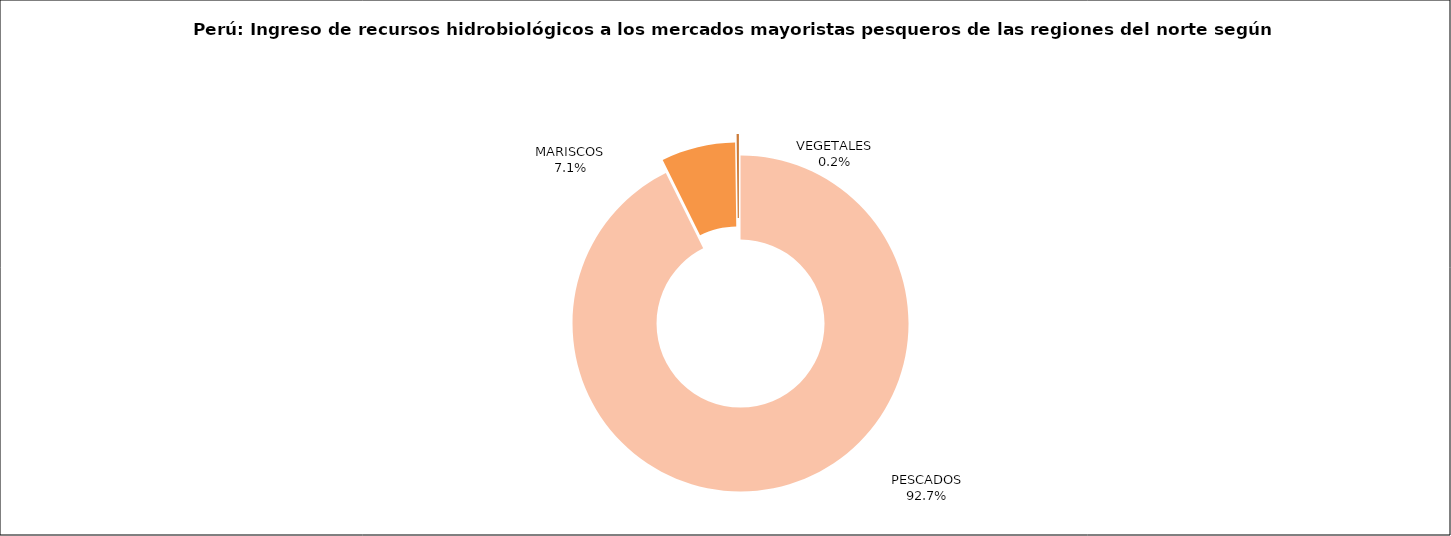
| Category | Series 0 |
|---|---|
| PESCADOS | 102737.423 |
| MARISCOS | 7890.129 |
| VEGETALES | 242.542 |